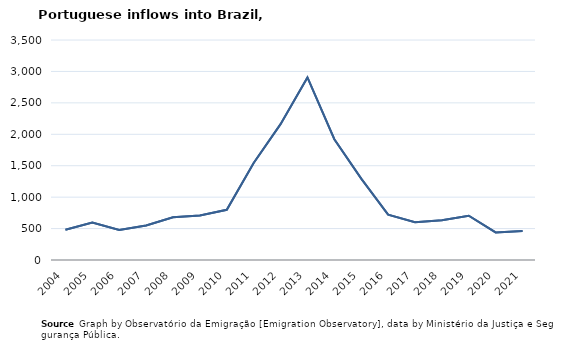
| Category | Entradas |
|---|---|
| 2004.0 | 482 |
| 2005.0 | 595 |
| 2006.0 | 477 |
| 2007.0 | 550 |
| 2008.0 | 679 |
| 2009.0 | 708 |
| 2010.0 | 798 |
| 2011.0 | 1543 |
| 2012.0 | 2161 |
| 2013.0 | 2904 |
| 2014.0 | 1921 |
| 2015.0 | 1294 |
| 2016.0 | 722 |
| 2017.0 | 601 |
| 2018.0 | 631 |
| 2019.0 | 705 |
| 2020.0 | 439 |
| 2021.0 | 461 |